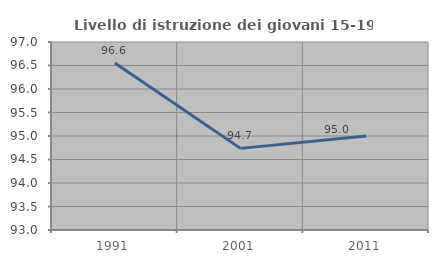
| Category | Livello di istruzione dei giovani 15-19 anni |
|---|---|
| 1991.0 | 96.552 |
| 2001.0 | 94.737 |
| 2011.0 | 95 |